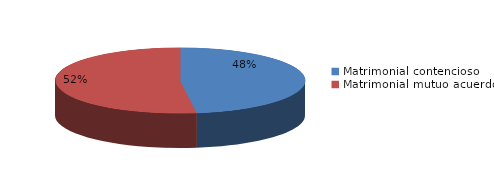
| Category | Series 0 |
|---|---|
| 0 | 1963 |
| 1 | 2136 |